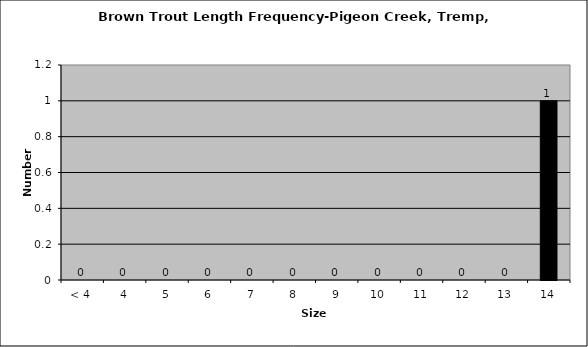
| Category | Series 0 |
|---|---|
| < 4 | 0 |
| 4 | 0 |
| 5 | 0 |
| 6 | 0 |
| 7 | 0 |
| 8 | 0 |
| 9 | 0 |
| 10 | 0 |
| 11 | 0 |
| 12 | 0 |
| 13 | 0 |
| 14 | 1 |